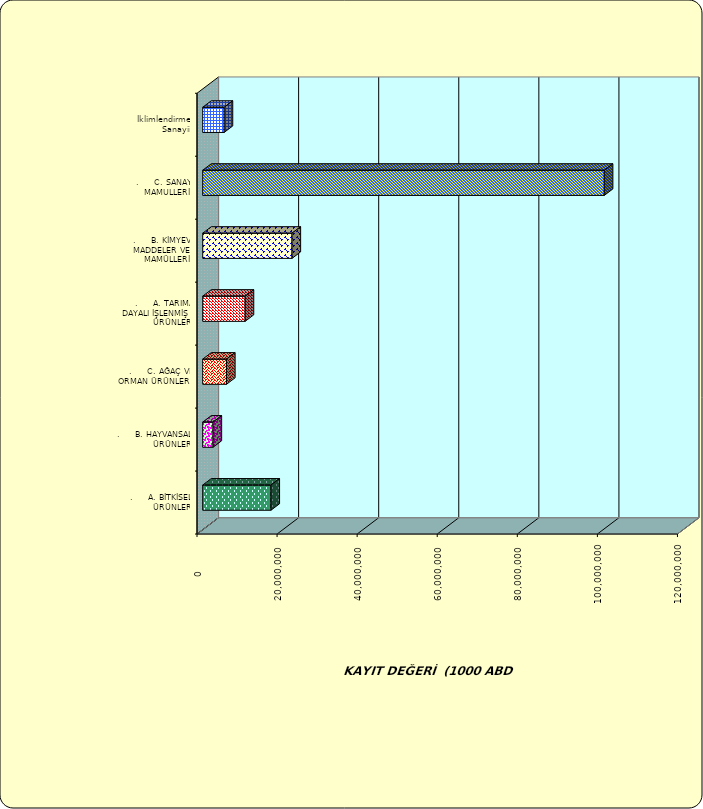
| Category | Series 0 |
|---|---|
| .     A. BİTKİSEL ÜRÜNLER | 17048605.014 |
| .     B. HAYVANSAL ÜRÜNLER | 2582544.356 |
| .     C. AĞAÇ VE ORMAN ÜRÜNLERİ | 5945035.585 |
| .     A. TARIMA DAYALI İŞLENMİŞ ÜRÜNLER | 10601771.379 |
| .     B. KİMYEVİ MADDELER VE MAMÜLLERİ | 22309301.625 |
| .     C. SANAYİ MAMULLERİ | 100295703.363 |
|  İklimlendirme Sanayii | 5359365.06 |